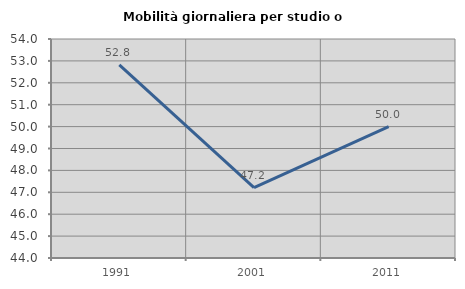
| Category | Mobilità giornaliera per studio o lavoro |
|---|---|
| 1991.0 | 52.814 |
| 2001.0 | 47.215 |
| 2011.0 | 50 |